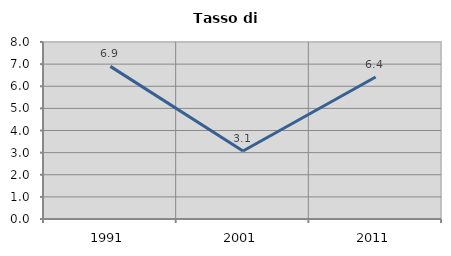
| Category | Tasso di disoccupazione   |
|---|---|
| 1991.0 | 6.898 |
| 2001.0 | 3.076 |
| 2011.0 | 6.417 |